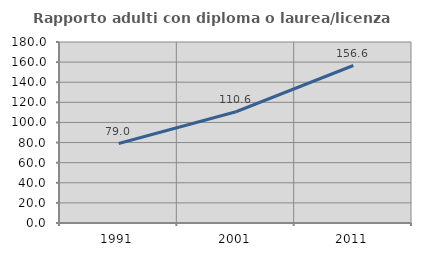
| Category | Rapporto adulti con diploma o laurea/licenza media  |
|---|---|
| 1991.0 | 79.002 |
| 2001.0 | 110.626 |
| 2011.0 | 156.63 |